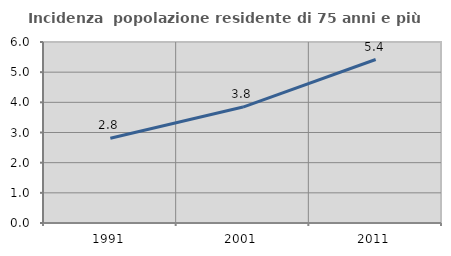
| Category | Incidenza  popolazione residente di 75 anni e più |
|---|---|
| 1991.0 | 2.81 |
| 2001.0 | 3.843 |
| 2011.0 | 5.42 |